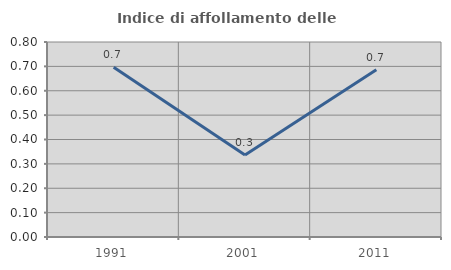
| Category | Indice di affollamento delle abitazioni  |
|---|---|
| 1991.0 | 0.697 |
| 2001.0 | 0.337 |
| 2011.0 | 0.686 |